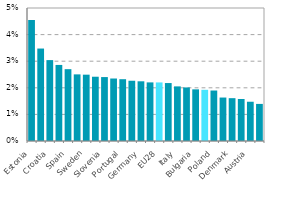
| Category | Series 0 |
|---|---|
| Estonia | 0.045 |
| Greece | 0.035 |
| Croatia | 0.03 |
| Romania | 0.029 |
| Spain | 0.027 |
| France | 0.025 |
| Sweden | 0.025 |
| Hungary | 0.024 |
| Slovenia | 0.024 |
| United Kingdom | 0.023 |
| Portugal | 0.023 |
| Latvia | 0.023 |
| Germany | 0.022 |
| Finland | 0.022 |
| EU28 | 0.022 |
| Slovakia | 0.022 |
| Italy | 0.021 |
| Ireland | 0.02 |
| Bulgaria | 0.019 |
| Czechia | 0.019 |
| Poland | 0.019 |
| Lithuania | 0.016 |
| Denmark | 0.016 |
| Belgium | 0.016 |
| Austria | 0.015 |
| Netherlands | 0.014 |